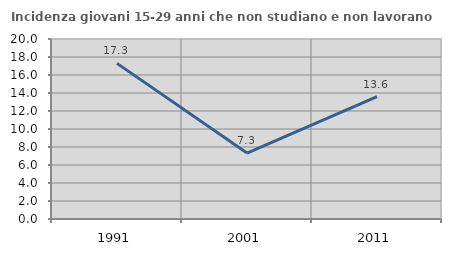
| Category | Incidenza giovani 15-29 anni che non studiano e non lavorano  |
|---|---|
| 1991.0 | 17.29 |
| 2001.0 | 7.333 |
| 2011.0 | 13.596 |